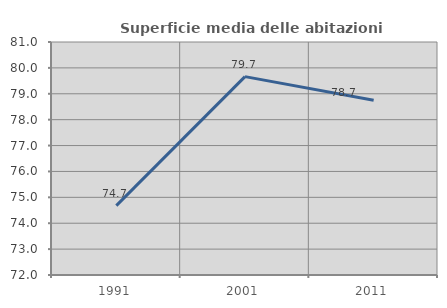
| Category | Superficie media delle abitazioni occupate |
|---|---|
| 1991.0 | 74.678 |
| 2001.0 | 79.662 |
| 2011.0 | 78.746 |